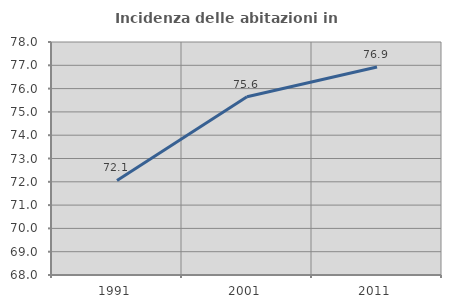
| Category | Incidenza delle abitazioni in proprietà  |
|---|---|
| 1991.0 | 72.058 |
| 2001.0 | 75.647 |
| 2011.0 | 76.93 |